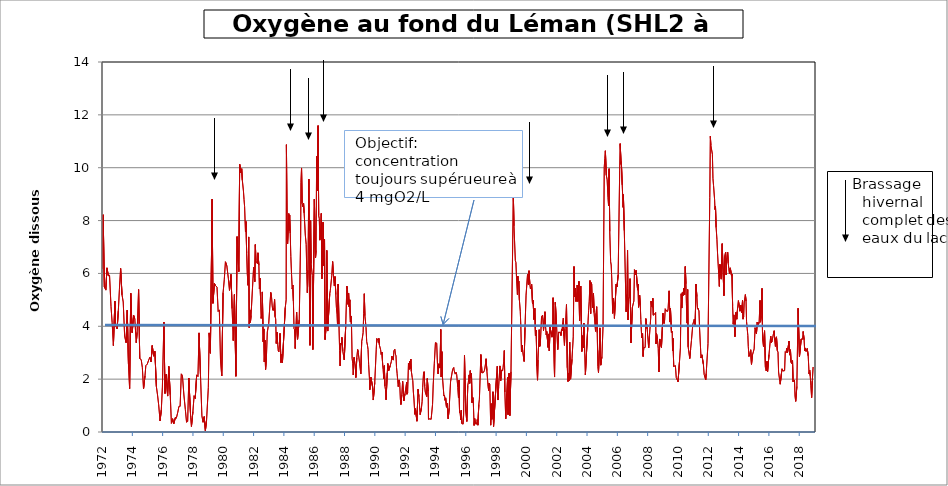
| Category | O2 (mgO2/L) |
|---|---|
| 1972-01-18 | 6.17 |
| 1972-02-15 | 8.22 |
| 1972-03-14 | 5.49 |
| 1972-04-18 | 5.37 |
| 1972-05-16 | 6.21 |
| 1972-06-19 | 5.91 |
| 1972-07-17 | 5.93 |
| 1972-08-22 | 4.74 |
| 1972-09-18 | 4.14 |
| 1972-10-18 | 3.27 |
| 1972-11-23 | 4.95 |
| 1972-12-11 | 4.02 |
| 1973-01-16 | 3.9 |
| 1973-02-14 | 4.59 |
| 1973-03-12 | 5.39 |
| 1973-04-10 | 6.19 |
| 1973-05-14 | 5.19 |
| 1973-06-12 | 4.92 |
| 1973-07-16 | 3.63 |
| 1973-08-20 | 3.38 |
| 1973-09-17 | 4.61 |
| 1973-10-16 | 2.57 |
| 1973-11-13 | 1.64 |
| 1973-12-10 | 5.25 |
| 1974-01-14 | 3.76 |
| 1974-02-18 | 4.41 |
| 1974-03-18 | 4.27 |
| 1974-04-22 | 3.38 |
| 1974-05-13 | 3.77 |
| 1974-06-17 | 5.39 |
| 1974-07-15 | 2.78 |
| 1974-08-19 | 2.74 |
| 1974-09-16 | 2.44 |
| 1974-10-14 | 1.63 |
| 1974-11-18 | 2.12 |
| 1974-12-09 | 2.51 |
| 1975-01-13 | 2.57 |
| 1975-02-17 | 2.73 |
| 1975-03-17 | 2.83 |
| 1975-04-14 | 2.65 |
| 1975-05-12 | 3.27 |
| 1975-06-16 | 2.87 |
| 1975-07-15 | 3.05 |
| 1975-08-20 | 1.72 |
| 1975-09-17 | 1.4 |
| 1975-10-14 | 1.03 |
| 1975-11-17 | 0.42 |
| 1975-12-17 | 0.84 |
| 1976-01-12 | 1.7 |
| 1976-02-17 | 4.16 |
| 1976-03-15 | 1.46 |
| 1976-04-12 | 2.18 |
| 1976-05-17 | 1.36 |
| 1976-06-14 | 2.48 |
| 1976-07-19 | 1.41 |
| 1976-08-16 | 0.33 |
| 1976-09-13 | 0.5 |
| 1976-10-11 | 0.31 |
| 1976-11-23 | 0.56 |
| 1976-12-13 | 0.52 |
| 1977-01-17 | 0.75 |
| 1977-02-14 | 0.97 |
| 1977-03-14 | 0.97 |
| 1977-04-12 | 2.2 |
| 1977-05-09 | 2.13 |
| 1977-06-13 | 1.4 |
| 1977-07-18 | 0.85 |
| 1977-08-16 | 0.37 |
| 1977-09-12 | 0.4 |
| 1977-10-10 | 2.04 |
| 1977-11-23 | 0.56 |
| 1977-12-12 | 0.21 |
| 1978-01-16 | 0.77 |
| 1978-02-14 | 1.37 |
| 1978-03-13 | 1.27 |
| 1978-04-17 | 2.16 |
| 1978-05-18 | 2.1 |
| 1978-06-13 | 3.75 |
| 1978-07-17 | 2.19 |
| 1978-08-21 | 0.61 |
| 1978-09-18 | 0.37 |
| 1978-10-16 | 0.58 |
| 1978-11-13 | 0.05 |
| 1978-12-11 | 0.44 |
| 1979-01-23 | 1.68 |
| 1979-02-12 | 3.75 |
| 1979-03-13 | 2.98 |
| 1979-04-25 | 8.81 |
| 1979-05-14 | 4.87 |
| 1979-06-18 | 5.62 |
| 1979-07-09 | 5.55 |
| 1979-08-20 | 5.48 |
| 1979-09-17 | 4.56 |
| 1979-10-15 | 4.62 |
| 1979-11-12 | 2.73 |
| 1979-12-12 | 2.12 |
| 1980-01-14 | 5.27 |
| 1980-02-11 | 5.76 |
| 1980-03-10 | 6.44 |
| 1980-04-14 | 6.27 |
| 1980-05-19 | 5.82 |
| 1980-06-16 | 5.36 |
| 1980-07-22 | 5.96 |
| 1980-08-18 | 4.67 |
| 1980-09-15 | 3.46 |
| 1980-10-13 | 5.2 |
| 1980-11-17 | 2.11 |
| 1980-12-16 | 7.39 |
| 1981-01-26 | 6.07 |
| 1981-02-16 | 10.13 |
| 1981-03-02 | 10.11 |
| 1981-03-17 | 9.81 |
| 1981-04-06 | 9.96 |
| 1981-04-21 | 9.53 |
| 1981-05-06 | 9.51 |
| 1981-05-18 | 9.12 |
| 1981-06-01 | 8.8 |
| 1981-06-15 | 8.53 |
| 1981-07-06 | 7.57 |
| 1981-07-20 | 7.96 |
| 1981-08-03 | 6.77 |
| 1981-08-19 | 5.98 |
| 1981-09-07 | 5.55 |
| 1981-09-21 | 7.38 |
| 1981-10-05 | 3.95 |
| 1981-10-19 | 4.62 |
| 1981-11-02 | 4.15 |
| 1981-11-17 | 4.41 |
| 1982-01-18 | 6.23 |
| 1982-02-15 | 5.69 |
| 1982-03-01 | 7.09 |
| 1982-03-15 | 6.48 |
| 1982-03-29 | 6.42 |
| 1982-04-20 | 6.37 |
| 1982-05-03 | 6.78 |
| 1982-05-25 | 6.31 |
| 1982-06-07 | 5.42 |
| 1982-06-21 | 5.82 |
| 1982-07-05 | 5.01 |
| 1982-07-20 | 4.3 |
| 1982-08-02 | 4.46 |
| 1982-08-16 | 5.3 |
| 1982-09-07 | 3.41 |
| 1982-09-21 | 3.9 |
| 1982-10-04 | 2.65 |
| 1982-10-18 | 3.47 |
| 1982-11-02 | 2.36 |
| 1982-11-22 | 2.8 |
| 1982-12-14 | 3.78 |
| 1983-01-17 | 4.1 |
| 1983-03-07 | 5.28 |
| 1983-03-28 | 5.07 |
| 1983-04-11 | 4.77 |
| 1983-04-25 | 4.61 |
| 1983-05-09 | 4.69 |
| 1983-05-24 | 4.6 |
| 1983-06-07 | 5.01 |
| 1983-06-20 | 4.36 |
| 1983-07-04 | 4.28 |
| 1983-07-18 | 3.35 |
| 1983-08-02 | 3.78 |
| 1983-08-22 | 3.32 |
| 1983-09-05 | 3.07 |
| 1983-09-19 | 3.03 |
| 1983-10-03 | 3.3 |
| 1983-10-17 | 3.73 |
| 1983-11-08 | 2.63 |
| 1983-11-30 | 2.93 |
| 1983-12-13 | 2.62 |
| 1984-02-20 | 4.71 |
| 1984-03-12 | 5 |
| 1984-03-19 | 10.87 |
| 1984-04-05 | 7.27 |
| 1984-04-16 | 7.12 |
| 1984-05-14 | 8.26 |
| 1984-05-22 | 7.63 |
| 1984-06-04 | 8.21 |
| 1984-06-18 | 7.52 |
| 1984-07-03 | 6.64 |
| 1984-07-19 | 6.01 |
| 1984-08-06 | 5.41 |
| 1984-08-20 | 5.56 |
| 1984-09-03 | 4.95 |
| 1984-09-18 | 3.91 |
| 1984-10-01 | 3.87 |
| 1984-10-17 | 3.16 |
| 1984-11-06 | 4.07 |
| 1984-11-19 | 4.54 |
| 1984-12-12 | 3.51 |
| 1985-01-22 | 4.25 |
| 1985-02-25 | 7.42 |
| 1985-03-04 | 9.44 |
| 1985-03-18 | 9.99 |
| 1985-04-01 | 8.65 |
| 1985-04-22 | 8.52 |
| 1985-05-06 | 8.65 |
| 1985-05-20 | 8.29 |
| 1985-06-04 | 8.27 |
| 1985-06-17 | 7.45 |
| 1985-07-08 | 7.1 |
| 1985-07-22 | 6.07 |
| 1985-08-05 | 5.27 |
| 1985-08-19 | 6.12 |
| 1985-09-11 | 9.57 |
| 1985-09-23 | 5.48 |
| 1985-10-07 | 3.28 |
| 1985-10-22 | 8 |
| 1985-11-04 | 6.37 |
| 1985-12-02 | 5.92 |
| 1985-12-16 | 3.12 |
| 1986-01-21 | 8.81 |
| 1986-02-18 | 6.59 |
| 1986-03-03 | 6.87 |
| 1986-03-17 | 10.43 |
| 1986-04-08 | 9.12 |
| 1986-04-21 | 11.59 |
| 1986-05-05 | 8.19 |
| 1986-05-20 | 8.07 |
| 1986-06-02 | 7.26 |
| 1986-06-16 | 7.48 |
| 1986-07-07 | 8.27 |
| 1986-07-21 | 5.8 |
| 1986-08-04 | 6.86 |
| 1986-08-18 | 7.94 |
| 1986-09-08 | 6.28 |
| 1986-09-23 | 7.3 |
| 1986-10-06 | 3.5 |
| 1986-11-06 | 4.1 |
| 1986-11-17 | 6.87 |
| 1986-12-08 | 3.82 |
| 1987-01-26 | 5.22 |
| 1987-02-09 | 5.35 |
| 1987-03-02 | 5.38 |
| 1987-03-17 | 5.92 |
| 1987-04-06 | 6.45 |
| 1987-04-21 | 6.02 |
| 1987-05-11 | 5.62 |
| 1987-05-18 | 5.53 |
| 1987-06-02 | 5.88 |
| 1987-06-22 | 5.2 |
| 1987-07-06 | 4.72 |
| 1987-07-22 | 4.46 |
| 1987-08-03 | 4.02 |
| 1987-08-18 | 5.6 |
| 1987-09-07 | 3.97 |
| 1987-09-22 | 3.08 |
| 1987-10-05 | 2.5 |
| 1987-10-20 | 3.36 |
| 1987-11-02 | 3.32 |
| 1987-11-16 | 3.58 |
| 1987-12-07 | 3.07 |
| 1988-01-11 | 2.73 |
| 1988-02-15 | 4 |
| 1988-03-14 | 5.52 |
| 1988-03-29 | 5.4 |
| 1988-04-11 | 4.83 |
| 1988-04-25 | 5.25 |
| 1988-05-09 | 4.74 |
| 1988-05-24 | 5 |
| 1988-06-08 | 4.17 |
| 1988-06-20 | 4.39 |
| 1988-07-05 | 3.98 |
| 1988-07-19 | 2.79 |
| 1988-08-03 | 2.6 |
| 1988-08-16 | 2.16 |
| 1988-09-05 | 2.82 |
| 1988-09-20 | 2.62 |
| 1988-10-04 | 2.54 |
| 1988-10-17 | 2.06 |
| 1988-11-09 | 2.81 |
| 1988-11-29 | 3.12 |
| 1988-12-12 | 3.02 |
| 1989-01-16 | 2.6 |
| 1989-02-13 | 2.2 |
| 1989-03-06 | 3.42 |
| 1989-03-20 | 3.53 |
| 1989-04-10 | 3.76 |
| 1989-04-24 | 4.49 |
| 1989-05-09 | 5.23 |
| 1989-05-22 | 4.4 |
| 1989-06-05 | 4.2 |
| 1989-06-19 | 3.95 |
| 1989-07-05 | 3.42 |
| 1989-07-24 | 3.28 |
| 1989-08-07 | 3.12 |
| 1989-08-21 | 2.56 |
| 1989-09-11 | 1.98 |
| 1989-09-18 | 1.6 |
| 1989-10-02 | 1.88 |
| 1989-10-16 | 2.07 |
| 1989-11-06 | 2.04 |
| 1989-11-20 | 1.74 |
| 1989-12-11 | 1.21 |
| 1990-01-15 | 1.87 |
| 1990-02-20 | 3.11 |
| 1990-03-05 | 3.54 |
| 1990-04-02 | 3.48 |
| 1990-04-12 | 3.39 |
| 1990-04-23 | 3.54 |
| 1990-05-09 | 3.28 |
| 1990-05-21 | 3.28 |
| 1990-06-06 | 3.11 |
| 1990-06-18 | 2.94 |
| 1990-07-09 | 3.02 |
| 1990-07-25 | 2.54 |
| 1990-08-06 | 2.37 |
| 1990-08-20 | 2.02 |
| 1990-09-03 | 2.51 |
| 1990-09-18 | 1.74 |
| 1990-10-01 | 1.6 |
| 1990-10-15 | 1.22 |
| 1990-11-13 | 2.24 |
| 1990-11-26 | 2.59 |
| 1990-12-17 | 2.32 |
| 1991-01-23 | 2.51 |
| 1991-02-18 | 2.66 |
| 1991-03-04 | 2.87 |
| 1991-03-18 | 2.76 |
| 1991-04-08 | 2.72 |
| 1991-04-22 | 3.07 |
| 1991-05-14 | 3.13 |
| 1991-05-28 | 2.95 |
| 1991-06-11 | 2.88 |
| 1991-06-24 | 2.44 |
| 1991-07-08 | 2.22 |
| 1991-07-22 | 1.96 |
| 1991-08-05 | 1.72 |
| 1991-08-26 | 1.97 |
| 1991-09-09 | 1.84 |
| 1991-09-25 | 1.24 |
| 1991-10-08 | 1.04 |
| 1991-10-29 | 1.4 |
| 1991-11-18 | 1.92 |
| 1991-12-16 | 1.18 |
| 1992-01-15 | 1.45 |
| 1992-02-24 | 1.89 |
| 1992-03-02 | 1.43 |
| 1992-03-17 | 1.48 |
| 1992-04-07 | 2.59 |
| 1992-04-21 | 2.37 |
| 1992-05-04 | 2.68 |
| 1992-05-20 | 2.41 |
| 1992-06-01 | 2.76 |
| 1992-06-15 | 2.3 |
| 1992-07-06 | 2.06 |
| 1992-07-20 | 1.94 |
| 1992-08-03 | 1.51 |
| 1992-08-17 | 1.25 |
| 1992-09-07 | 0.67 |
| 1992-09-22 | 0.88 |
| 1992-10-14 | 0.86 |
| 1992-10-27 | 0.41 |
| 1992-11-09 | 0.97 |
| 1992-11-23 | 1.62 |
| 1992-12-14 | 1.34 |
| 1993-01-14 | 0.66 |
| 1993-02-13 | 0.91 |
| 1993-03-02 | 1.16 |
| 1993-03-15 | 1.68 |
| 1993-04-05 | 2.22 |
| 1993-04-19 | 2.28 |
| 1993-05-03 | 1.74 |
| 1993-05-17 | 1.51 |
| 1993-06-07 | 1.51 |
| 1993-06-21 | 1.34 |
| 1993-07-05 | 2.02 |
| 1993-07-26 | 1.55 |
| 1993-08-02 | 0.48 |
| 1993-08-23 | 0.48 |
| 1993-09-06 | 0.5 |
| 1993-09-21 | 0.52 |
| 1993-10-05 | 0.48 |
| 1993-11-08 | 1.04 |
| 1993-11-24 | 1.78 |
| 1993-12-20 | 2.58 |
| 1994-01-17 | 3.38 |
| 1994-02-16 | 3.36 |
| 1994-03-07 | 2.56 |
| 1994-03-21 | 2.2 |
| 1994-04-12 | 2.58 |
| 1994-04-25 | 2.53 |
| 1994-05-09 | 2.42 |
| 1994-05-24 | 3.88 |
| 1994-06-06 | 2.08 |
| 1994-06-20 | 3.04 |
| 1994-07-04 | 2.1 |
| 1994-07-18 | 2.08 |
| 1994-08-09 | 1.36 |
| 1994-08-22 | 1.4 |
| 1994-09-05 | 1.2 |
| 1994-09-20 | 1.29 |
| 1994-10-10 | 0.94 |
| 1994-10-25 | 1.09 |
| 1994-11-07 | 1.08 |
| 1994-11-21 | 0.5 |
| 1994-12-14 | 0.9 |
| 1995-01-16 | 1.9 |
| 1995-02-13 | 2.16 |
| 1995-03-08 | 2.37 |
| 1995-04-03 | 2.44 |
| 1995-04-10 | 2.34 |
| 1995-04-24 | 2.34 |
| 1995-05-09 | 2.19 |
| 1995-05-29 | 2.26 |
| 1995-06-13 | 2.17 |
| 1995-06-26 | 2.15 |
| 1995-07-10 | 1.68 |
| 1995-07-26 | 1.3 |
| 1995-08-07 | 1.96 |
| 1995-08-21 | 0.74 |
| 1995-09-06 | 0.69 |
| 1995-09-19 | 0.46 |
| 1995-10-02 | 0.82 |
| 1995-10-16 | 0.32 |
| 1995-11-15 | 0.3 |
| 1995-11-27 | 0.64 |
| 1995-12-18 | 2.9 |
| 1996-01-15 | 0.8 |
| 1996-02-12 | 0.4 |
| 1996-03-05 | 1.76 |
| 1996-03-18 | 1.86 |
| 1996-04-09 | 2.16 |
| 1996-04-22 | 1.84 |
| 1996-05-06 | 2.32 |
| 1996-05-20 | 2.06 |
| 1996-06-03 | 2.21 |
| 1996-06-17 | 1.11 |
| 1996-07-02 | 1.31 |
| 1996-07-15 | 1.26 |
| 1996-08-05 | 0.25 |
| 1996-08-19 | 0.51 |
| 1996-09-04 | 0.34 |
| 1996-09-24 | 0.29 |
| 1996-10-14 | 0.38 |
| 1996-10-21 | 0.47 |
| 1996-11-04 | 0.26 |
| 1996-11-27 | 1.04 |
| 1996-12-11 | 1.24 |
| 1997-01-15 | 2.93 |
| 1997-02-10 | 2.24 |
| 1997-03-03 | 2.25 |
| 1997-03-17 | 2.25 |
| 1997-04-09 | 2.32 |
| 1997-04-23 | 2.42 |
| 1997-05-13 | 2.64 |
| 1997-05-21 | 2.77 |
| 1997-06-09 | 2.32 |
| 1997-06-25 | 2.3 |
| 1997-07-09 | 1.72 |
| 1997-07-22 | 1.57 |
| 1997-08-04 | 1.85 |
| 1997-08-19 | 1.78 |
| 1997-09-09 | 0.26 |
| 1997-09-23 | 1.07 |
| 1997-10-06 | 0.48 |
| 1997-10-20 | 0.45 |
| 1997-11-03 | 1.52 |
| 1997-11-17 | 0.2 |
| 1997-12-08 | 0.2 |
| 1998-02-02 | 2.22 |
| 1998-02-16 | 2.49 |
| 1998-03-02 | 1.21 |
| 1998-03-19 | 1.69 |
| 1998-04-20 | 2.5 |
| 1998-05-06 | 1.93 |
| 1998-05-20 | 2.1 |
| 1998-06-02 | 2.35 |
| 1998-06-22 | 2.31 |
| 1998-07-06 | 2.45 |
| 1998-07-20 | 2.68 |
| 1998-08-04 | 3.08 |
| 1998-08-17 | 1.51 |
| 1998-09-07 | 0.5 |
| 1998-09-29 | 1.46 |
| 1998-10-21 | 2.06 |
| 1998-11-02 | 0.66 |
| 1998-11-25 | 2.22 |
| 1998-12-14 | 0.62 |
| 1999-01-11 | 2.28 |
| 1999-03-01 | 8.01 |
| 1999-03-08 | 9.09 |
| 1999-03-24 | 7.8 |
| 1999-04-26 | 6.49 |
| 1999-05-10 | 6.41 |
| 1999-05-25 | 5.83 |
| 1999-06-16 | 5.2 |
| 1999-06-24 | 5.9 |
| 1999-07-05 | 5.6 |
| 1999-07-19 | 5.7 |
| 1999-08-02 | 4.99 |
| 1999-08-23 | 4.57 |
| 1999-09-06 | 3.98 |
| 1999-09-21 | 3.03 |
| 1999-10-05 | 3.29 |
| 1999-10-19 | 3.07 |
| 1999-11-24 | 2.67 |
| 1999-12-15 | 3.93 |
| 2000-01-10 | 5.18 |
| 2000-02-14 | 5.96 |
| 2000-03-06 | 5.58 |
| 2000-03-21 | 6.1 |
| 2000-04-10 | 5.59 |
| 2000-04-25 | 5.41 |
| 2000-05-09 | 5.45 |
| 2000-05-23 | 5.59 |
| 2000-06-13 | 4.86 |
| 2000-06-28 | 4.98 |
| 2000-07-17 | 4.26 |
| 2000-07-25 | 4.44 |
| 2000-08-08 | 4.68 |
| 2000-08-23 | 3.65 |
| 2000-09-11 | 3.85 |
| 2000-09-25 | 2.48 |
| 2000-10-12 | 1.96 |
| 2000-10-23 | 2.73 |
| 2000-11-22 | 3.87 |
| 2000-12-04 | 3.24 |
| 2000-12-19 | 3.35 |
| 2001-01-17 | 4.37 |
| 2001-02-12 | 4.42 |
| 2001-03-05 | 3.84 |
| 2001-03-26 | 4.31 |
| 2001-04-09 | 4.55 |
| 2001-04-24 | 3.98 |
| 2001-05-09 | 3.68 |
| 2001-05-22 | 3.8 |
| 2001-06-11 | 3.81 |
| 2001-06-25 | 3.2 |
| 2001-07-09 | 3.71 |
| 2001-07-23 | 3.07 |
| 2001-08-09 | 3.97 |
| 2001-08-21 | 3.94 |
| 2001-09-24 | 3.59 |
| 2001-10-09 | 3.83 |
| 2001-10-22 | 5.08 |
| 2001-11-26 | 2.08 |
| 2001-12-15 | 4.91 |
| 2002-01-15 | 3.96 |
| 2002-02-11 | 3.12 |
| 2002-03-05 | 3.78 |
| 2002-03-18 | 3.81 |
| 2002-04-17 | 3.76 |
| 2002-04-30 | 3.65 |
| 2002-05-15 | 3.89 |
| 2002-05-29 | 3.84 |
| 2002-06-12 | 4.12 |
| 2002-06-27 | 4.31 |
| 2002-07-08 | 3.64 |
| 2002-07-23 | 3.28 |
| 2002-08-05 | 3.89 |
| 2002-08-19 | 4.11 |
| 2002-09-10 | 4.82 |
| 2002-09-30 | 2.43 |
| 2002-10-16 | 1.91 |
| 2002-10-28 | 2.22 |
| 2002-11-13 | 1.95 |
| 2002-11-25 | 3.4 |
| 2002-12-17 | 2 |
| 2003-01-20 | 2.75 |
| 2003-02-20 | 3.6 |
| 2003-03-10 | 6.26 |
| 2003-03-24 | 5.12 |
| 2003-04-14 | 5.44 |
| 2003-04-28 | 4.94 |
| 2003-05-12 | 5.16 |
| 2003-05-27 | 5.56 |
| 2003-06-10 | 4.94 |
| 2003-06-23 | 5.04 |
| 2003-07-07 | 5.7 |
| 2003-07-22 | 4.2 |
| 2003-08-04 | 5.08 |
| 2003-08-20 | 5.52 |
| 2003-09-15 | 3.05 |
| 2003-09-29 | 3.64 |
| 2003-10-13 | 3.18 |
| 2003-10-24 | 3.65 |
| 2003-11-03 | 4.12 |
| 2003-11-18 | 3.33 |
| 2003-12-09 | 2.16 |
| 2004-02-04 | 3.93 |
| 2004-02-25 | 4.6 |
| 2004-03-11 | 4.95 |
| 2004-03-29 | 5.73 |
| 2004-04-14 | 4.48 |
| 2004-04-26 | 5.65 |
| 2004-05-10 | 5.6 |
| 2004-05-25 | 4.96 |
| 2004-06-07 | 4.7 |
| 2004-06-21 | 5.24 |
| 2004-07-06 | 4.52 |
| 2004-07-19 | 4.53 |
| 2004-08-10 | 3.81 |
| 2004-08-23 | 4.49 |
| 2004-09-06 | 4.74 |
| 2004-09-20 | 3.76 |
| 2004-10-05 | 2.48 |
| 2004-10-20 | 2.25 |
| 2004-11-09 | 3.095 |
| 2004-11-23 | 3.94 |
| 2004-12-13 | 2.53 |
| 2005-01-10 | 2.85 |
| 2005-02-07 | 4.01 |
| 2005-03-08 | 10.02 |
| 2005-03-21 | 10.34 |
| 2005-04-04 | 10.64 |
| 2005-04-26 | 9.72 |
| 2005-05-17 | 9.54 |
| 2005-06-06 | 8.88 |
| 2005-06-20 | 8.56 |
| 2005-07-04 | 9.96 |
| 2005-07-18 | 7.59 |
| 2005-08-09 | 6.44 |
| 2005-08-22 | 6.32 |
| 2005-09-05 | 5.79 |
| 2005-09-27 | 4.49 |
| 2005-10-10 | 5.07 |
| 2005-10-24 | 4.84 |
| 2005-11-08 | 4.3 |
| 2005-12-19 | 5.59 |
| 2006-01-09 | 5.49 |
| 2006-02-06 | 5.94 |
| 2006-03-15 | 9.91 |
| 2006-03-27 | 10.91 |
| 2006-04-18 | 10.13 |
| 2006-04-24 | 10.22 |
| 2006-05-15 | 9.35 |
| 2006-06-06 | 8.5 |
| 2006-06-12 | 8.98 |
| 2006-07-04 | 7.62 |
| 2006-07-18 | 7.63 |
| 2006-08-17 | 4.55 |
| 2006-09-04 | 5.21 |
| 2006-09-20 | 6.88 |
| 2006-10-03 | 4.24 |
| 2006-10-17 | 5.02 |
| 2006-11-07 | 5.13 |
| 2006-11-20 | 5.8 |
| 2006-12-11 | 3.37 |
| 2007-01-15 | 4.72 |
| 2007-02-20 | 4.96 |
| 2007-03-06 | 6.14 |
| 2007-03-22 | 6.05 |
| 2007-04-02 | 5.96 |
| 2007-04-16 | 6.11 |
| 2007-05-21 | 5.37 |
| 2007-06-04 | 5.59 |
| 2007-06-12 | 4.72 |
| 2007-07-09 | 5.17 |
| 2007-07-25 | 4.78 |
| 2007-08-06 | 4.26 |
| 2007-08-27 | 3.56 |
| 2007-09-17 | 3.72 |
| 2007-10-01 | 2.86 |
| 2007-10-15 | 3.19 |
| 2007-11-19 | 3.2 |
| 2007-12-05 | 4.29 |
| 2008-01-08 | 3.89 |
| 2008-02-11 | 3.18 |
| 2008-03-03 | 3.67 |
| 2008-03-31 | 4.31 |
| 2008-04-09 | 4.95 |
| 2008-04-21 | 4.76 |
| 2008-05-13 | 4.72 |
| 2008-05-22 | 5.06 |
| 2008-06-02 | 4.42 |
| 2008-06-17 | 4.42 |
| 2008-07-10 | 4.47 |
| 2008-07-28 | 4.52 |
| 2008-08-06 | 3.33 |
| 2008-08-18 | 3.73 |
| 2008-09-09 | 3.51 |
| 2008-09-29 | 3.17 |
| 2008-10-15 | 2.27 |
| 2008-10-27 | 2.86 |
| 2008-11-04 | 3.52 |
| 2008-12-15 | 3.2 |
| 2009-01-21 | 4.49 |
| 2009-02-16 | 4.11 |
| 2009-03-02 | 4.24 |
| 2009-03-17 | 4.66 |
| 2009-04-06 | 4.59 |
| 2009-04-21 | 4.61 |
| 2009-05-12 | 4.56 |
| 2009-05-25 | 4.66 |
| 2009-06-18 | 5.34 |
| 2009-06-29 | 4.71 |
| 2009-07-06 | 4.16 |
| 2009-07-20 | 4.69 |
| 2009-08-13 | 3.77 |
| 2009-08-31 | 3.81 |
| 2009-09-09 | 3.08 |
| 2009-09-21 | 3.54 |
| 2009-10-06 | 2.48 |
| 2009-11-16 | 2.51 |
| 2009-12-07 | 2.06 |
| 2010-01-19 | 1.9 |
| 2010-02-24 | 2.69 |
| 2010-03-17 | 3.18 |
| 2010-03-29 | 4.69 |
| 2010-04-06 | 5.23 |
| 2010-04-19 | 4.69 |
| 2010-05-03 | 5.27 |
| 2010-05-17 | 5.16 |
| 2010-06-09 | 5.44 |
| 2010-06-28 | 5.2 |
| 2010-07-13 | 6.26 |
| 2010-07-28 | 5.61 |
| 2010-08-09 | 4.85 |
| 2010-08-26 | 4.12 |
| 2010-09-07 | 5.39 |
| 2010-09-20 | 3.22 |
| 2010-10-07 | 3.25 |
| 2010-10-28 | 2.78 |
| 2010-11-18 | 3.14 |
| 2010-12-08 | 3.46 |
| 2011-01-10 | 4.07 |
| 2011-02-14 | 4.26 |
| 2011-03-08 | 4.06 |
| 2011-03-28 | 5.6 |
| 2011-04-18 | 5.125 |
| 2011-05-02 | 4.65 |
| 2011-05-11 | 4.69 |
| 2011-05-30 | 4.68 |
| 2011-06-07 | 4.58 |
| 2011-06-21 | 3.95 |
| 2011-07-04 | 3.95 |
| 2011-07-27 | 2.8 |
| 2011-08-16 | 2.92 |
| 2011-09-22 | 2.56 |
| 2011-09-28 | 2.53 |
| 2011-10-10 | 2.18 |
| 2011-11-16 | 1.97 |
| 2011-11-29 | 2.21 |
| 2012-01-11 | 3.35 |
| 2012-02-23 | 8.87 |
| 2012-03-08 | 11.19 |
| 2012-03-19 | 10.85 |
| 2012-04-26 | 10.51 |
| 2012-05-09 | 9.6 |
| 2012-05-24 | 9.32 |
| 2012-06-18 | 8.79 |
| 2012-06-27 | 8.42 |
| 2012-07-09 | 8.55 |
| 2012-07-25 | 7.74 |
| 2012-08-13 | 7.29 |
| 2012-08-28 | 6.77 |
| 2012-09-11 | 6.75 |
| 2012-09-26 | 5.95 |
| 2012-10-11 | 5.51 |
| 2012-10-23 | 6.344 |
| 2012-11-13 | 5.93 |
| 2012-11-26 | 5.785 |
| 2012-12-19 | 7.125 |
| 2013-01-28 | 5.16 |
| 2013-02-14 | 6.64 |
| 2013-03-11 | 6.81 |
| 2013-03-26 | 5.94 |
| 2013-04-03 | 6.53 |
| 2013-04-15 | 6.61 |
| 2013-04-29 | 6.8 |
| 2013-05-13 | 6.38 |
| 2013-05-27 | 6.18 |
| 2013-06-11 | 5.99 |
| 2013-07-01 | 6.21 |
| 2013-07-17 | 6.19 |
| 2013-08-01 | 5.9 |
| 2013-08-12 | 5.97 |
| 2013-08-26 | 4.78 |
| 2013-09-11 | 4.08 |
| 2013-09-24 | 4.43 |
| 2013-10-21 | 3.61 |
| 2013-11-12 | 4.52 |
| 2013-12-04 | 4.27 |
| 2013-12-16 | 4.56 |
| 2014-01-13 | 4.968 |
| 2014-02-18 | 4.572 |
| 2014-03-12 | 4.796 |
| 2014-03-25 | 4.63 |
| 2014-04-07 | 4.508 |
| 2014-04-22 | 4.978 |
| 2014-05-05 | 4.271 |
| 2014-05-19 | 4.369 |
| 2014-06-02 | 4.918 |
| 2014-06-30 | 5.197 |
| 2014-07-16 | 4.953 |
| 2014-07-28 | 4.182 |
| 2014-08-12 | 3.923 |
| 2014-08-28 | 3.65 |
| 2014-09-08 | 3.237 |
| 2014-09-24 | 2.86 |
| 2014-10-08 | 2.924 |
| 2014-10-20 | 2.888 |
| 2014-11-05 | 3.11 |
| 2014-11-24 | 2.562 |
| 2014-12-15 | 2.902 |
| 2015-01-27 | 3.144 |
| 2015-02-19 | 3.945 |
| 2015-03-09 | 3.95 |
| 2015-03-23 | 3.72 |
| 2015-04-13 | 4.16 |
| 2015-04-29 | 4.014 |
| 2015-05-11 | 4.012 |
| 2015-05-28 | 4.165 |
| 2015-06-18 | 4.977 |
| 2015-06-29 | 4.157 |
| 2015-07-16 | 4.385 |
| 2015-08-05 | 5.433 |
| 2015-08-18 | 3.529 |
| 2015-09-09 | 3.239 |
| 2015-10-05 | 3.829 |
| 2015-10-26 | 2.446 |
| 2015-11-16 | 2.31 |
| 2015-12-02 | 2.669 |
| 2015-12-17 | 2.289 |
| 2016-01-20 | 2.93 |
| 2016-03-01 | 3.63 |
| 2016-03-15 | 3.37 |
| 2016-04-04 | 3.45 |
| 2016-04-21 | 3.43 |
| 2016-05-09 | 3.74 |
| 2016-05-24 | 3.83 |
| 2016-06-06 | 3.48 |
| 2016-06-23 | 3.24 |
| 2016-07-05 | 3.55 |
| 2016-07-18 | 3.6 |
| 2016-08-08 | 3.08 |
| 2016-08-24 | 3.02 |
| 2016-09-07 | 2.27 |
| 2016-09-19 | 2.12 |
| 2016-10-17 | 1.81 |
| 2016-11-15 | 2.22 |
| 2016-11-30 | 2.39 |
| 2016-12-15 | 2.31 |
| 2017-01-30 | 2.32 |
| 2017-02-15 | 3.04 |
| 2017-03-08 | 3 |
| 2017-03-20 | 3.17 |
| 2017-04-10 | 3 |
| 2017-05-02 | 3.03 |
| 2017-05-15 | 3.44 |
| 2017-06-01 | 2.91 |
| 2017-06-20 | 3.11 |
| 2017-07-04 | 2.64 |
| 2017-07-18 | 2.59 |
| 2017-08-09 | 2.7 |
| 2017-08-22 | 1.9 |
| 2017-09-04 | 1.93 |
| 2017-09-25 | 1.97 |
| 2017-10-09 | 1.36 |
| 2017-10-24 | 1.16 |
| 2017-11-21 | 1.72 |
| 2017-12-21 | 4.68 |
| 2018-01-23 | 2.85 |
| 2018-02-14 | 2.86 |
| 2018-03-06 | 3.52 |
| 2018-03-26 | 3.5 |
| 2018-04-09 | 3.51 |
| 2018-04-23 | 3.8 |
| 2018-05-15 | 3.49 |
| 2018-05-29 | 3.07 |
| 2018-06-12 | 3.18 |
| 2018-07-02 | 3.05 |
| 2018-07-17 | 3.08 |
| 2018-07-30 | 3.16 |
| 2018-08-22 | 2.88 |
| 2018-09-12 | 2.2 |
| 2018-09-26 | 2.34 |
| 2018-10-09 | 2.13 |
| 2018-10-24 | 1.77 |
| 2018-11-12 | 1.3 |
| 2018-11-28 | 1.93 |
| 2018-12-18 | 2.46 |